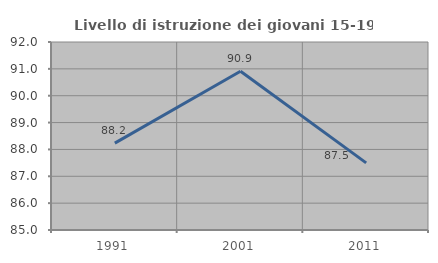
| Category | Livello di istruzione dei giovani 15-19 anni |
|---|---|
| 1991.0 | 88.235 |
| 2001.0 | 90.909 |
| 2011.0 | 87.5 |